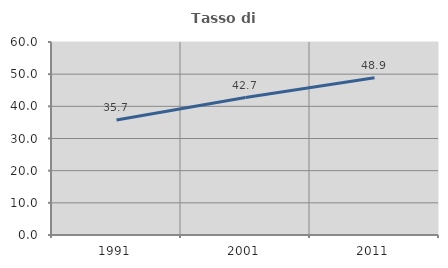
| Category | Tasso di occupazione   |
|---|---|
| 1991.0 | 35.733 |
| 2001.0 | 42.721 |
| 2011.0 | 48.908 |